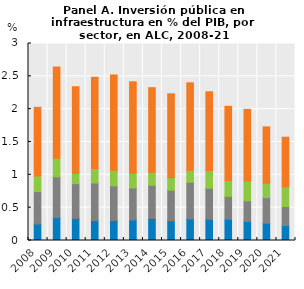
| Category | Agua | Energía | Telecomunicaciones | Transporte |
|---|---|---|---|---|
| 2008.0 | 0.251 | 0.495 | 0.238 | 1.045 |
| 2009.0 | 0.349 | 0.621 | 0.284 | 1.388 |
| 2010.0 | 0.338 | 0.527 | 0.161 | 1.317 |
| 2011.0 | 0.303 | 0.573 | 0.219 | 1.39 |
| 2012.0 | 0.305 | 0.527 | 0.238 | 1.451 |
| 2013.0 | 0.313 | 0.488 | 0.224 | 1.392 |
| 2014.0 | 0.335 | 0.506 | 0.2 | 1.287 |
| 2015.0 | 0.302 | 0.464 | 0.19 | 1.278 |
| 2016.0 | 0.329 | 0.556 | 0.184 | 1.331 |
| 2017.0 | 0.324 | 0.472 | 0.27 | 1.199 |
| 2018.0 | 0.323 | 0.35 | 0.242 | 1.129 |
| 2019.0 | 0.29 | 0.313 | 0.302 | 1.092 |
| 2020.0 | 0.263 | 0.389 | 0.22 | 0.859 |
| 2021.0 | 0.226 | 0.29 | 0.301 | 0.755 |